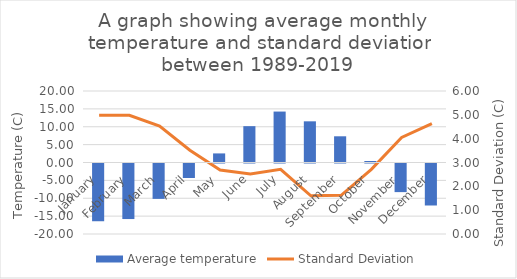
| Category | Average temperature |
|---|---|
| January | -16.152 |
| February | -15.537 |
| March | -9.897 |
| April | -4.055 |
| May | 2.541 |
| June | 10.166 |
| July | 14.248 |
| August | 11.518 |
| September | 7.331 |
| October | 0.414 |
| November | -8.003 |
| December | -11.746 |